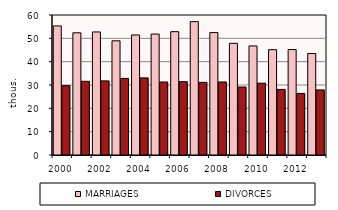
| Category | MARRIAGES | DIVORCES |
|---|---|---|
| 2000.0 | 55321 | 29704 |
| 2001.0 | 52374 | 31586 |
| 2002.0 | 52732 | 31758 |
| 2003.0 | 48943 | 32824 |
| 2004.0 | 51447 | 33060 |
| 2005.0 | 51829 | 31288 |
| 2006.0 | 52860 | 31415 |
| 2007.0 | 57157 | 31129 |
| 2008.0 | 52457 | 31300 |
| 2009.0 | 47862 | 29133 |
| 2010.0 | 46746 | 30783 |
| 2011.0 | 45137 | 28113 |
| 2012.0 | 45206 | 26402 |
| 2013.0 | 43499 | 27895 |